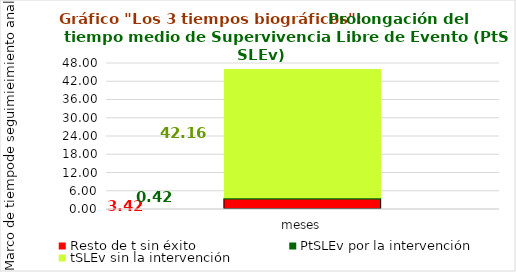
| Category | Resto de t sin éxito | PtSLEv por la intervención | tSLEv sin la intervención |
|---|---|---|---|
| meses | 3.417 | 0.421 | 42.163 |